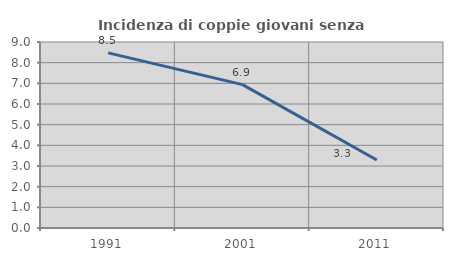
| Category | Incidenza di coppie giovani senza figli |
|---|---|
| 1991.0 | 8.475 |
| 2001.0 | 6.936 |
| 2011.0 | 3.288 |